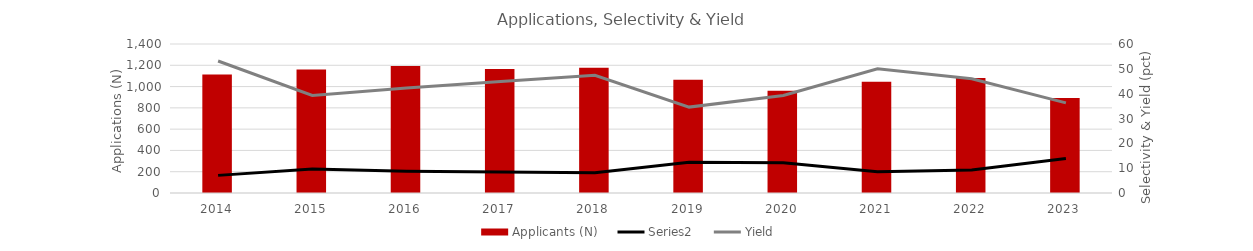
| Category | Applicants (N) |
|---|---|
| 2014.0 | 1113 |
| 2015.0 | 1160 |
| 2016.0 | 1193 |
| 2017.0 | 1165 |
| 2018.0 | 1177 |
| 2019.0 | 1065 |
| 2020.0 | 961 |
| 2021.0 | 1045 |
| 2022.0 | 1080 |
| 2023.0 | 892 |